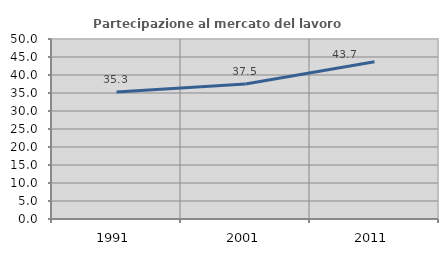
| Category | Partecipazione al mercato del lavoro  femminile |
|---|---|
| 1991.0 | 35.282 |
| 2001.0 | 37.528 |
| 2011.0 | 43.699 |